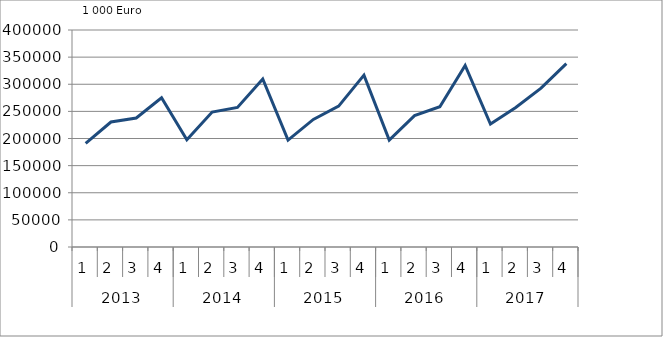
| Category | Ausbaugewerblicher Umsatz3 |
|---|---|
| 0 | 191088.978 |
| 1 | 230353.875 |
| 2 | 237735.574 |
| 3 | 275098.219 |
| 4 | 197732.754 |
| 5 | 248690.349 |
| 6 | 257339.084 |
| 7 | 309632.186 |
| 8 | 197030.42 |
| 9 | 235094.994 |
| 10 | 259758.438 |
| 11 | 316833.232 |
| 12 | 197219.532 |
| 13 | 242069.899 |
| 14 | 258547.84 |
| 15 | 334764.305 |
| 16 | 226552.317 |
| 17 | 257191.13 |
| 18 | 292853.372 |
| 19 | 338154.691 |